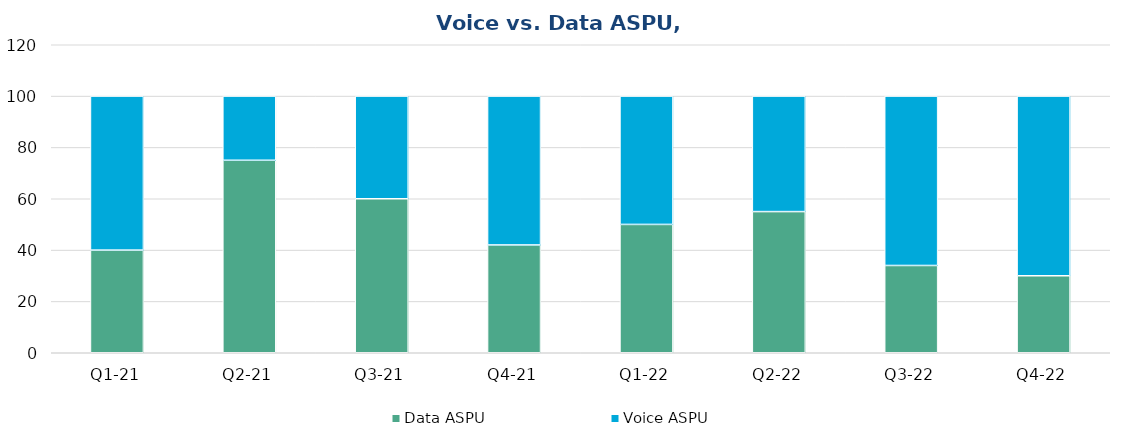
| Category | Data ASPU | Voice ASPU |
|---|---|---|
| Q1-21 | 40 | 60 |
| Q2-21 | 75 | 25 |
| Q3-21 | 60 | 40 |
| Q4-21 | 42 | 58 |
| Q1-22 | 50 | 50 |
| Q2-22 | 55 | 45 |
| Q3-22 | 34 | 66 |
| Q4-22 | 30 | 70 |